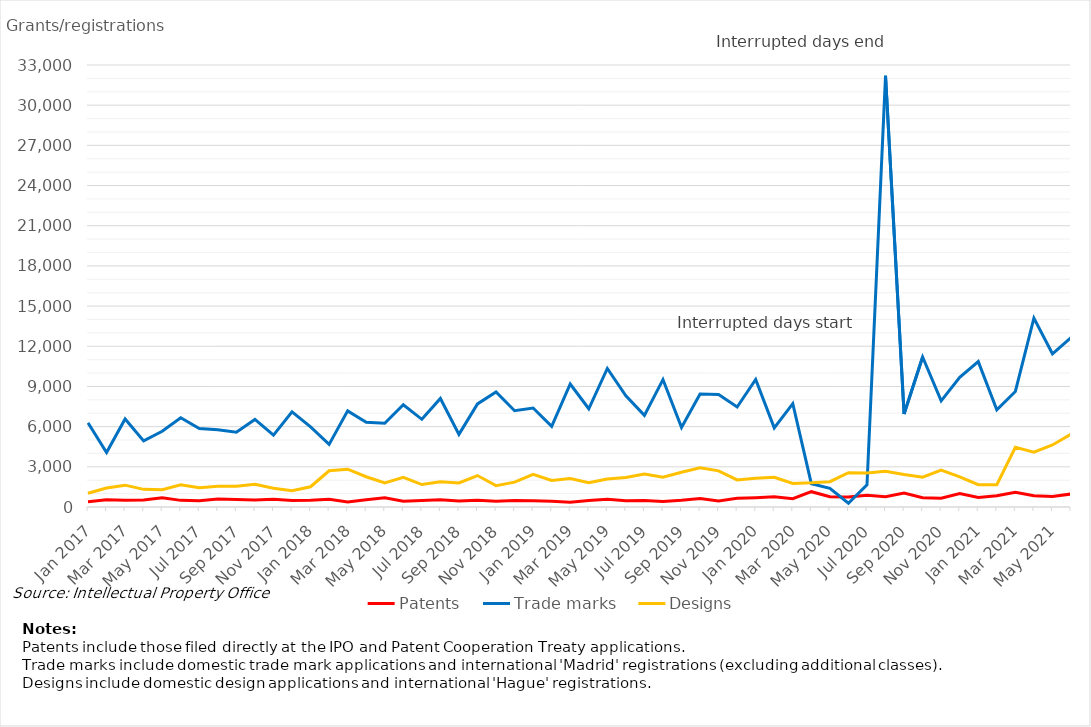
| Category | Patents | Trade marks | Designs |
|---|---|---|---|
| Jan 2017 | 387 | 6288 | 1026 |
| Feb 2017 | 533 | 4063 | 1420 |
| Mar 2017 | 505 | 6576 | 1631 |
| Apr 2017 | 516 | 4937 | 1318 |
| May 2017 | 681 | 5651 | 1284 |
| Jun 2017 | 495 | 6659 | 1660 |
| Jul 2017 | 466 | 5857 | 1437 |
| Aug 2017 | 592 | 5763 | 1550 |
| Sep 2017 | 554 | 5578 | 1553 |
| Oct 2017 | 517 | 6539 | 1705 |
| Nov 2017 | 578 | 5364 | 1397 |
| Dec 2017 | 487 | 7101 | 1218 |
| Jan 2018 | 495 | 5978 | 1512 |
| Feb 2018 | 574 | 4670 | 2704 |
| Mar 2018 | 370 | 7176 | 2825 |
| Apr 2018 | 543 | 6332 | 2259 |
| May 2018 | 690 | 6251 | 1789 |
| Jun 2018 | 424 | 7636 | 2222 |
| Jul 2018 | 486 | 6547 | 1678 |
| Aug 2018 | 536 | 8103 | 1878 |
| Sep 2018 | 450 | 5426 | 1795 |
| Oct 2018 | 498 | 7699 | 2348 |
| Nov 2018 | 432 | 8591 | 1592 |
| Dec 2018 | 484 | 7189 | 1859 |
| Jan 2019 | 475 | 7393 | 2444 |
| Feb 2019 | 426 | 6021 | 1987 |
| Mar 2019 | 363 | 9184 | 2125 |
| Apr 2019 | 488 | 7335 | 1810 |
| May 2019 | 573 | 10345 | 2096 |
| Jun 2019 | 471 | 8304 | 2202 |
| Jul 2019 | 489 | 6839 | 2464 |
| Aug 2019 | 420 | 9515 | 2218 |
| Sep 2019 | 500 | 5942 | 2596 |
| Oct 2019 | 634 | 8436 | 2926 |
| Nov 2019 | 455 | 8398 | 2700 |
| Dec 2019 | 654 | 7465 | 2021 |
| Jan 2020 | 696 | 9517 | 2145 |
| Feb 2020 | 756 | 5905 | 2220 |
| Mar 2020 | 622 | 7719 | 1758 |
| Apr 2020 | 1143 | 1741 | 1803 |
| May 2020 | 768 | 1398 | 1888 |
| Jun 2020 | 740 | 280 | 2564 |
| Jul 2020 | 878 | 1657 | 2539 |
| Aug 2020 | 771 | 32198 | 2665 |
| Sep 2020 | 1042 | 6941 | 2425 |
| Oct 2020 | 697 | 11197 | 2223 |
| Nov 2020 | 649 | 7926 | 2763 |
| Dec 2020 | 1010 | 9680 | 2252 |
| Jan 2021 | 708 | 10856 | 1665 |
| Feb 2021 | 838 | 7254 | 1661 |
| Mar 2021 | 1107 | 8626 | 4453 |
| Apr 2021 | 838 | 14099 | 4098 |
| May 2021 | 788 | 11439 | 4628 |
| June 2021 | 972 | 12653 | 5436 |